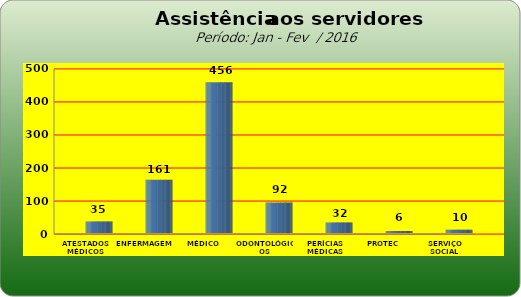
| Category | Series 0 |
|---|---|
| ATESTADOS MÉDICOS | 35 |
| ENFERMAGEM | 161 |
| MÉDICO | 456 |
| ODONTOLÓGICOS | 92 |
| PERÍCIAS MÉDICAS | 32 |
| PROTEC | 6 |
| SERVIÇO SOCIAL | 10 |